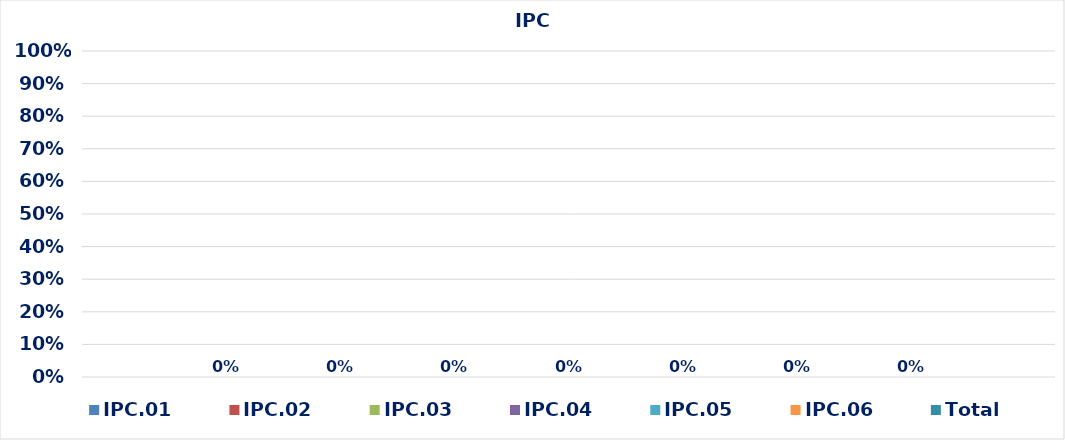
| Category | IPC.01 | IPC.02 | IPC.03 | IPC.04 | IPC.05 | IPC.06 | Total |
|---|---|---|---|---|---|---|---|
| 0 | 0 | 0 | 0 | 0 | 0 | 0 | 0 |